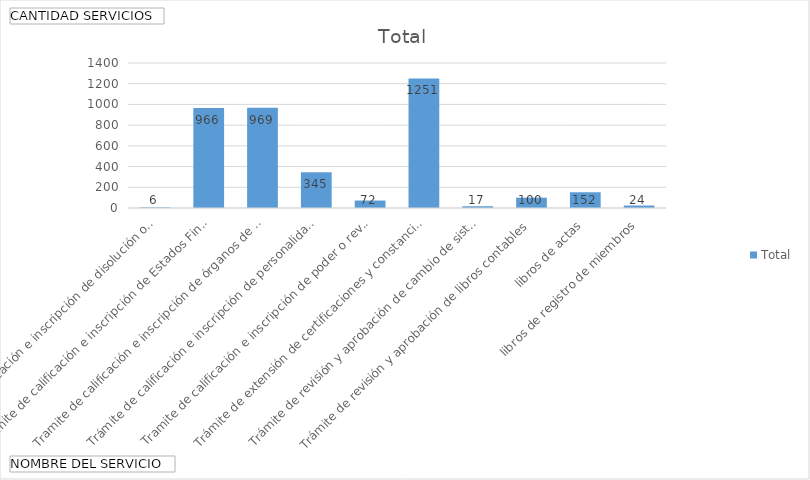
| Category | Total |
|---|---|
| Tramite de calificación e inscripción de disolución o liquidación | 6 |
| Tramite de calificación e inscripción de Estados Financieros | 966 |
| Tramite de calificación e inscripción de órganos de administración  | 969 |
| Trámite de calificación e inscripción de personalidad jurídica y estatutos | 345 |
| Tramite de calificación e inscripción de poder o revocatoria | 72 |
| Trámite de extensión de certificaciones y constancias | 1251 |
| Trámite de revisión y aprobación de cambio de sistema contable informal a formal | 17 |
| Trámite de revisión y aprobación de libros contables, libros de actas, libros de registro de miembros | 100 |
| Trámite de revisión y aprobación de sistemas contables formales e informales | 152 |
| Tramite por extravío de libros | 24 |